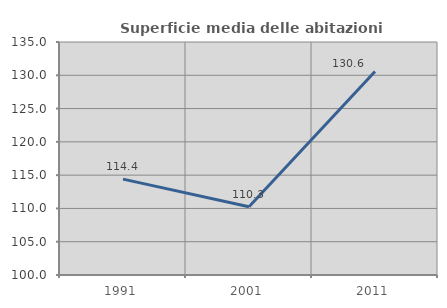
| Category | Superficie media delle abitazioni occupate |
|---|---|
| 1991.0 | 114.397 |
| 2001.0 | 110.251 |
| 2011.0 | 130.568 |